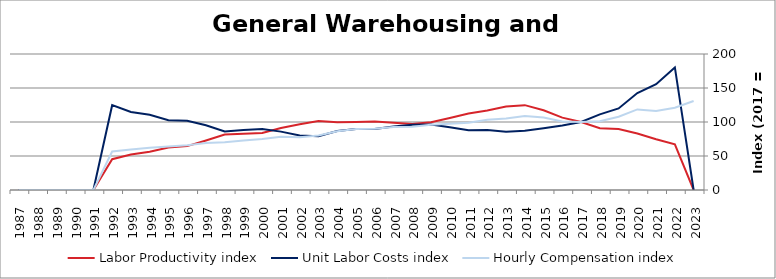
| Category | Labor Productivity index | Unit Labor Costs index | Hourly Compensation index |
|---|---|---|---|
| 2023.0 | 0 | 0 | 130.944 |
| 2022.0 | 67.111 | 180.324 | 121.017 |
| 2021.0 | 74.623 | 155.652 | 116.152 |
| 2020.0 | 83.105 | 142.594 | 118.503 |
| 2019.0 | 89.771 | 119.925 | 107.658 |
| 2018.0 | 90.892 | 111.266 | 101.132 |
| 2017.0 | 100 | 100 | 100 |
| 2016.0 | 106.425 | 94.736 | 100.822 |
| 2015.0 | 117.214 | 90.935 | 106.588 |
| 2014.0 | 124.774 | 87.081 | 108.655 |
| 2013.0 | 122.794 | 85.663 | 105.189 |
| 2012.0 | 116.982 | 88.259 | 103.247 |
| 2011.0 | 112.494 | 87.789 | 98.757 |
| 2010.0 | 105.782 | 92.132 | 97.459 |
| 2009.0 | 99.56 | 96.425 | 96.001 |
| 2008.0 | 96.906 | 95.932 | 92.964 |
| 2007.0 | 98.881 | 93.525 | 92.478 |
| 2006.0 | 100.687 | 89.56 | 90.175 |
| 2005.0 | 99.866 | 89.679 | 89.558 |
| 2004.0 | 99.543 | 86.761 | 86.364 |
| 2003.0 | 101.377 | 79.171 | 80.261 |
| 2002.0 | 96.667 | 80.123 | 77.452 |
| 2001.0 | 91.059 | 85.847 | 78.172 |
| 2000.0 | 83.754 | 89.602 | 75.045 |
| 1999.0 | 82.631 | 88.113 | 72.808 |
| 1998.0 | 81.576 | 86.208 | 70.325 |
| 1997.0 | 72.756 | 95.193 | 69.258 |
| 1996.0 | 64.528 | 101.82 | 65.703 |
| 1995.0 | 62.337 | 102.749 | 64.051 |
| 1994.0 | 56.293 | 110.524 | 62.217 |
| 1993.0 | 52.064 | 114.682 | 59.708 |
| 1992.0 | 45.361 | 124.732 | 56.58 |
| 1991.0 | 0 | 0 | 0 |
| 1990.0 | 0 | 0 | 0 |
| 1989.0 | 0 | 0 | 0 |
| 1988.0 | 0 | 0 | 0 |
| 1987.0 | 0 | 0 | 0 |